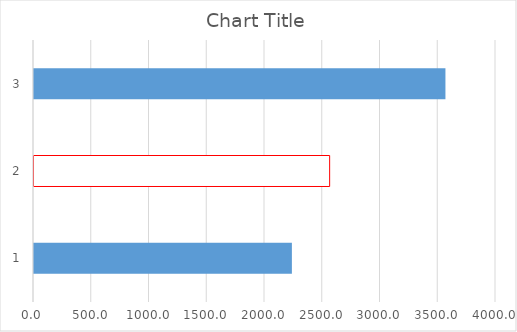
| Category | Series 0 |
|---|---|
| 0 | 2232.791 |
| 1 | 2559.7 |
| 2 | 3562.209 |